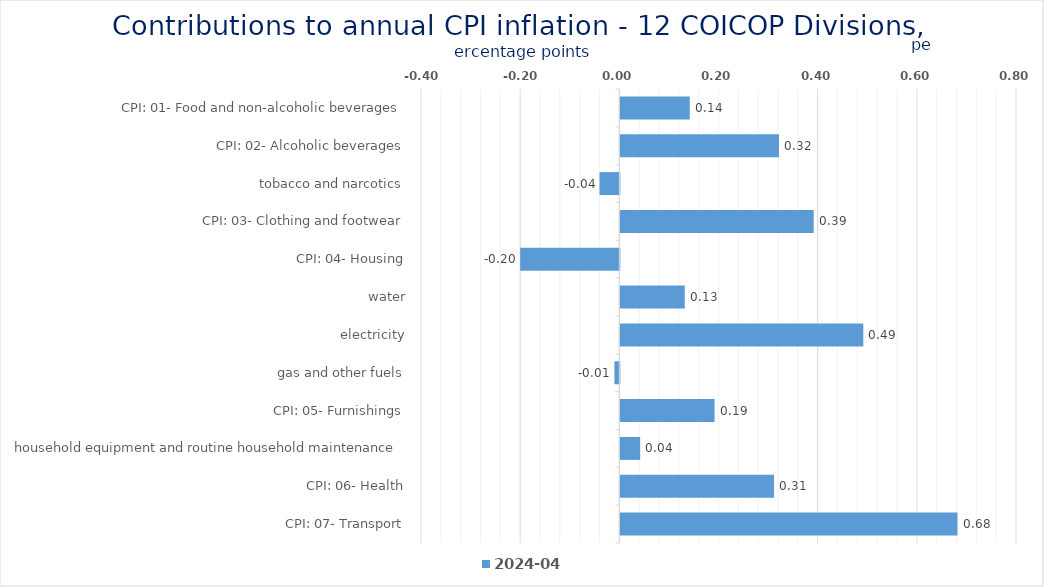
| Category | 2024-04 |
|---|---|
| CPI: 01- Food and non-alcoholic beverages | 0.14 |
| CPI: 02- Alcoholic beverages, tobacco and narcotics | 0.32 |
| CPI: 03- Clothing and footwear | -0.04 |
| CPI: 04- Housing, water, electricity, gas and other fuels | 0.39 |
| CPI: 05- Furnishings, household equipment and routine household maintenance | -0.2 |
| CPI: 06- Health | 0.13 |
| CPI: 07- Transport | 0.49 |
| CPI: 08- Communication | -0.01 |
| CPI: 09- Recreation and culture | 0.19 |
| CPI: 10- Education | 0.04 |
| CPI: 11- Restaurants and hotels | 0.31 |
| CPI: 12- Miscellaneous goods and services | 0.68 |